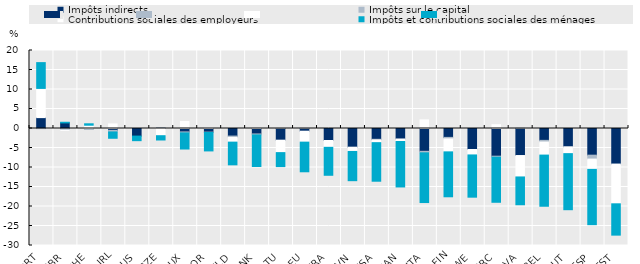
| Category | Impôts indirects | Impôts sur le capital | Contributions sociales des employeurs | Impôts et contributions sociales des ménages |
|---|---|---|---|---|
| PRT | 2.79 | -0.03 | 7.486 | 6.615 |
| GBR | 1.434 | -0.433 | -0.066 | 0.169 |
| CHE | -0.065 | -0.173 | 0.84 | 0.365 |
| IRL | -0.482 | -0.406 | 1.174 | -1.618 |
| AUS | -1.945 | 0 | 0 | -1.174 |
| CZE | 0.074 | 0.002 | -1.845 | -1.104 |
| LUX | -0.877 | -0.246 | 1.79 | -4.139 |
| NOR | -0.932 | -0.08 | 0.231 | -4.737 |
| NLD | -1.943 | -0.344 | -1.208 | -5.821 |
| DNK | -1.399 | -0.244 | 0.004 | -8.106 |
| LTU | -2.995 | 0.009 | -3.188 | -3.582 |
| DEU | -0.693 | 0.019 | -2.803 | -7.603 |
| FRA | -3.07 | -0.011 | -1.744 | -7.171 |
| SVN | -4.811 | -0.014 | -1.061 | -7.494 |
| USA | -2.769 | -0.196 | -0.664 | -9.889 |
| CAN | -2.688 | 0 | -0.644 | -11.657 |
| ITA | -5.851 | -0.39 | 2.216 | -12.745 |
| FIN | -2.279 | -0.376 | -3.336 | -11.517 |
| SWE | -5.388 | 0 | -1.389 | -10.832 |
| GRC | -7.102 | -0.25 | 0.978 | -11.566 |
| LVA | -6.931 | 0.071 | -5.491 | -7.132 |
| BEL | -3.042 | -0.42 | -3.355 | -13.121 |
| AUT | -4.704 | -0.044 | -1.696 | -14.377 |
| ESP | -6.838 | -1.004 | -2.636 | -14.183 |
| EST | -9.118 | 0 | -10.192 | -8.034 |